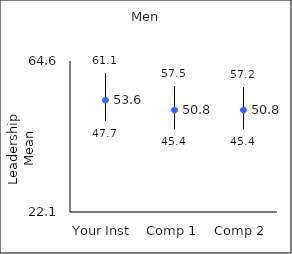
| Category | 25th percentile | 75th percentile | Mean |
|---|---|---|---|
| Your Inst | 47.7 | 61.1 | 53.58 |
| Comp 1 | 45.4 | 57.5 | 50.8 |
| Comp 2 | 45.4 | 57.2 | 50.8 |